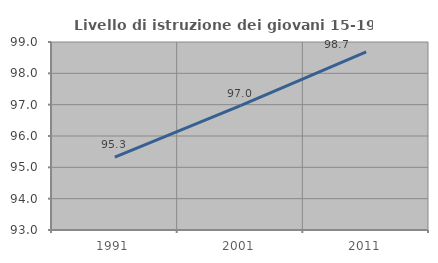
| Category | Livello di istruzione dei giovani 15-19 anni |
|---|---|
| 1991.0 | 95.327 |
| 2001.0 | 96.97 |
| 2011.0 | 98.684 |